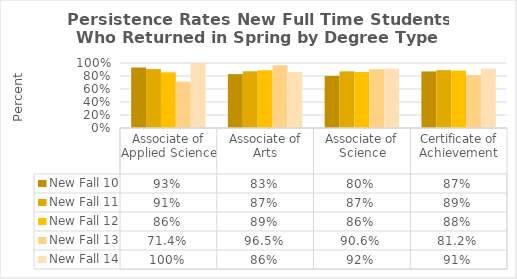
| Category | New Fall 10 | New Fall 11 | New Fall 12 | New Fall 13 | New Fall 14 |
|---|---|---|---|---|---|
| Associate of Applied Science | 0.931 | 0.906 | 0.857 | 0.714 | 1 |
| Associate of Arts | 0.828 | 0.872 | 0.888 | 0.965 | 0.861 |
| Associate of Science | 0.802 | 0.872 | 0.861 | 0.906 | 0.916 |
| Certificate of Achievement | 0.87 | 0.89 | 0.883 | 0.812 | 0.914 |